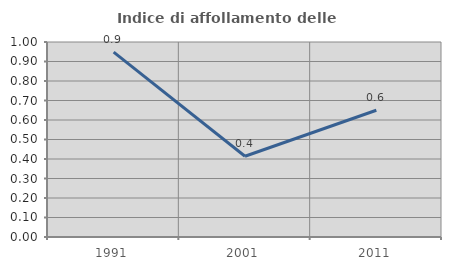
| Category | Indice di affollamento delle abitazioni  |
|---|---|
| 1991.0 | 0.948 |
| 2001.0 | 0.414 |
| 2011.0 | 0.65 |